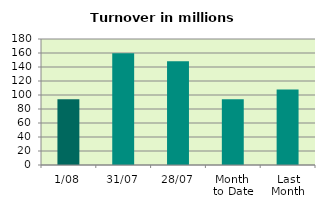
| Category | Series 0 |
|---|---|
| 1/08 | 93.941 |
| 31/07 | 159.584 |
| 28/07 | 148.308 |
| Month 
to Date | 93.941 |
| Last
Month | 108.022 |